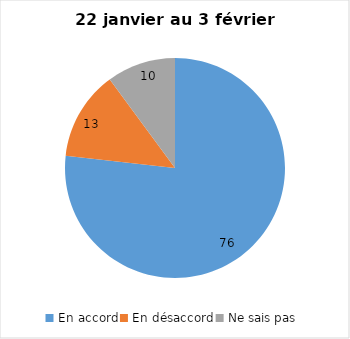
| Category | Series 0 |
|---|---|
| En accord | 76 |
| En désaccord | 13 |
| Ne sais pas | 10 |